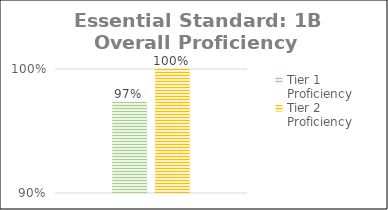
| Category | Tier 1 Proficiency | Tier 2 Proficiency |
|---|---|---|
| 0 | 0.974 | 1 |